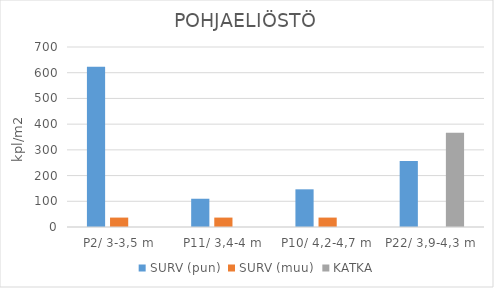
| Category | SURV (pun) | SURV (muu) | KATKA |
|---|---|---|---|
| P2/ 3-3,5 m | 622.711 | 36.63 | 0 |
| P11/ 3,4-4 m | 109.89 | 36.63 | 0 |
| P10/ 4,2-4,7 m | 146.52 | 36.63 | 0 |
| P22/ 3,9-4,3 m | 256.41 | 0 | 366.3 |